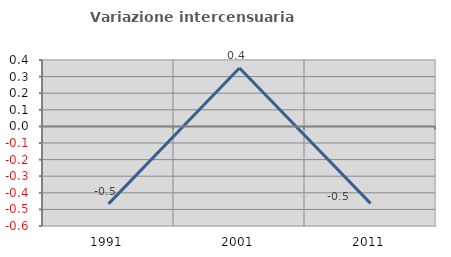
| Category | Variazione intercensuaria annua |
|---|---|
| 1991.0 | -0.467 |
| 2001.0 | 0.351 |
| 2011.0 | -0.464 |